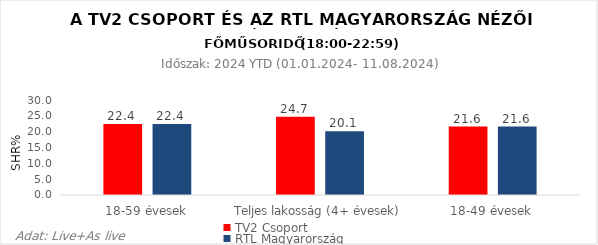
| Category | TV2 Csoport | RTL Magyarország |
|---|---|---|
| 18-59 évesek | 22.4 | 22.4 |
| Teljes lakosság (4+ évesek) | 24.7 | 20.1 |
| 18-49 évesek | 21.6 | 21.6 |